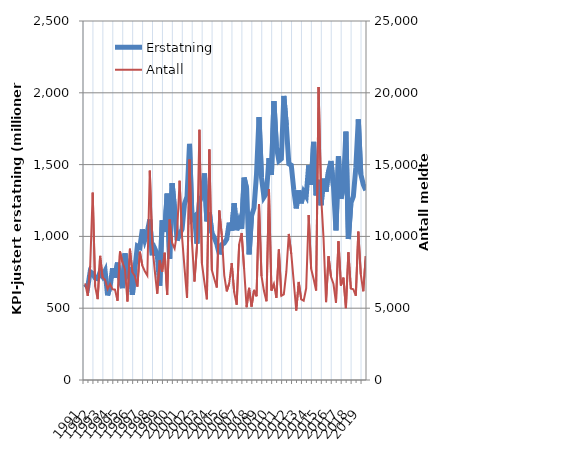
| Category | Erstatning |
|---|---|
| 1991.0 | 668.377 |
| nan | 646.581 |
| nan | 754.432 |
| nan | 741.609 |
| 1992.0 | 709.589 |
| nan | 705.058 |
| nan | 752.809 |
| nan | 722.622 |
| 1993.0 | 758.784 |
| nan | 589.287 |
| nan | 650.166 |
| nan | 778.102 |
| 1994.0 | 712.455 |
| nan | 817.302 |
| nan | 700.489 |
| nan | 639.562 |
| 1995.0 | 881.484 |
| nan | 745.057 |
| nan | 786.145 |
| nan | 592.863 |
| 1996.0 | 772.434 |
| nan | 933.167 |
| nan | 923.86 |
| nan | 1048.284 |
| 1997.0 | 975.022 |
| nan | 1031.089 |
| nan | 1117.841 |
| nan | 869.051 |
| 1998.0 | 915.532 |
| nan | 877.337 |
| nan | 657.534 |
| nan | 1112.093 |
| 1999.0 | 1030.399 |
| nan | 1297.537 |
| nan | 845.324 |
| nan | 1370.455 |
| 2000.0 | 1188.476 |
| nan | 972.629 |
| nan | 1016.859 |
| nan | 1049.426 |
| 2001.0 | 1226.681 |
| nan | 1276.887 |
| nan | 1644.134 |
| nan | 1120.494 |
| 2002.0 | 1138.064 |
| nan | 949.841 |
| nan | 1239.396 |
| nan | 1281.954 |
| 2003.0 | 1438.421 |
| nan | 1104.151 |
| nan | 1165.549 |
| nan | 1026.476 |
| 2004.0 | 989.984 |
| nan | 947.034 |
| nan | 875.783 |
| nan | 943.512 |
| 2005.0 | 953.736 |
| nan | 981.198 |
| nan | 1096.128 |
| nan | 1040.177 |
| 2006.0 | 1231.698 |
| nan | 1043.219 |
| nan | 1106.334 |
| nan | 1052.433 |
| 2007.0 | 1409.372 |
| nan | 1335.117 |
| nan | 874.721 |
| nan | 1144.317 |
| 2008.0 | 1198.545 |
| nan | 1433.943 |
| nan | 1830.915 |
| nan | 1410.434 |
| 2009.0 | 1273.501 |
| nan | 1300.183 |
| nan | 1545.356 |
| nan | 1427.831 |
| 2010.0 | 1942.1 |
| nan | 1625.257 |
| nan | 1525.945 |
| nan | 1540.664 |
| 2011.0 | 1978.185 |
| nan | 1774.784 |
| nan | 1506.14 |
| nan | 1495.144 |
| 2012.0 | 1324.317 |
| nan | 1194.78 |
| nan | 1320.346 |
| nan | 1230.217 |
| 2013.0 | 1308.944 |
| nan | 1279.929 |
| nan | 1495.19 |
| nan | 1358.95 |
| 2014.0 | 1657.918 |
| nan | 1285.255 |
| nan | 1394.337 |
| nan | 1216.987 |
| 2015.0 | 1402.102 |
| nan | 1310.659 |
| nan | 1455.552 |
| nan | 1525.138 |
| 2016.0 | 1346.401 |
| nan | 1041.827 |
| nan | 1557.387 |
| nan | 1263.116 |
| 2017.0 | 1342.687 |
| nan | 1729.988 |
| nan | 981.99 |
| nan | 1231.16 |
| 2018.0 | 1278.2 |
| nan | 1479.986 |
| nan | 1814.335 |
| nan | 1433.378 |
| 2019.0 | 1362.237 |
| nan | 1320.798 |